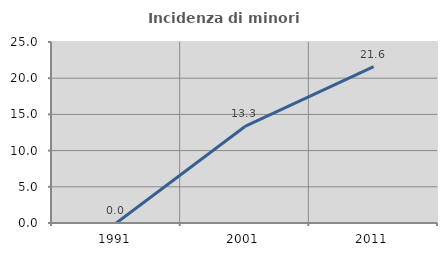
| Category | Incidenza di minori stranieri |
|---|---|
| 1991.0 | 0 |
| 2001.0 | 13.333 |
| 2011.0 | 21.591 |